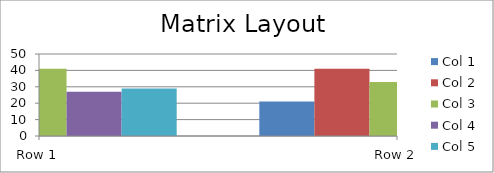
| Category | Col 1 | Col 2 | Col 3 | Col 4 | Col 5 |
|---|---|---|---|---|---|
| Row 1 | 32 | 29 | 41 | 27 | 29 |
| Row 2 | 21 | 41 | 33 | 37 | 26 |